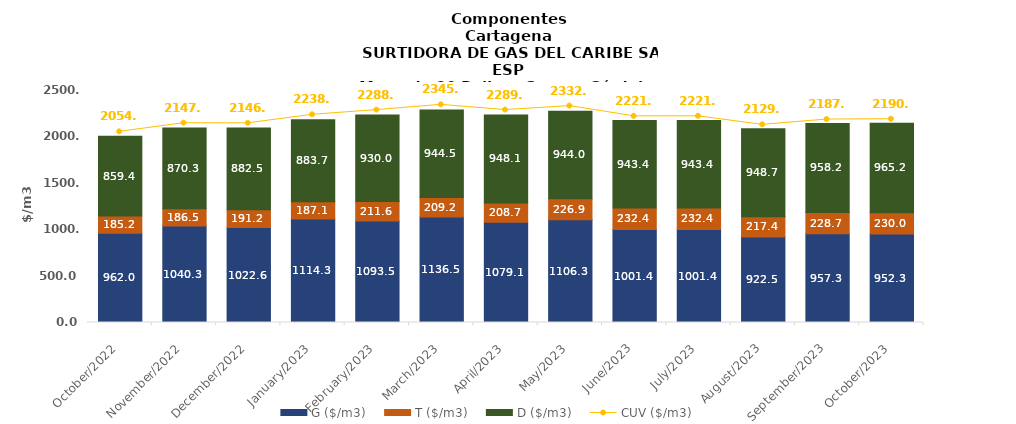
| Category | G ($/m3) | T ($/m3) | D ($/m3) |
|---|---|---|---|
| 2022-10-01 | 962.02 | 185.17 | 859.36 |
| 2022-11-01 | 1040.34 | 186.54 | 870.26 |
| 2022-12-01 | 1022.62 | 191.17 | 882.47 |
| 2023-01-01 | 1114.3 | 187.05 | 883.66 |
| 2023-02-01 | 1093.5 | 211.55 | 930.03 |
| 2023-03-01 | 1136.5 | 209.16 | 944.52 |
| 2023-04-01 | 1079.14 | 208.7 | 948.13 |
| 2023-05-01 | 1106.33 | 226.94 | 944.03 |
| 2023-06-01 | 1001.4 | 232.37 | 943.37 |
| 2023-07-01 | 1001.4 | 232.37 | 943.37 |
| 2023-08-01 | 922.47 | 217.36 | 948.72 |
| 2023-09-01 | 957.29 | 228.69 | 958.18 |
| 2023-10-01 | 952.33 | 230.03 | 965.19 |